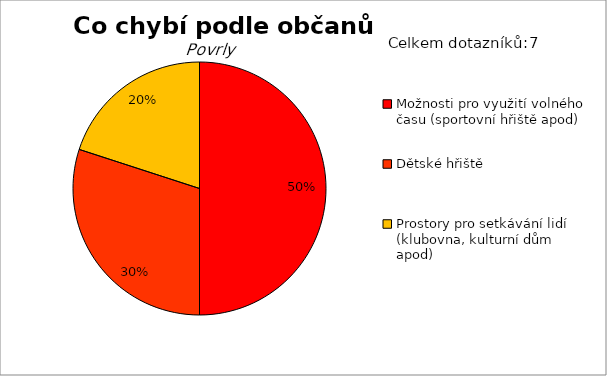
| Category | Series 0 |
|---|---|
| Možnosti pro využití volného času (sportovní hřiště apod) | 5 |
| Dětské hřiště | 3 |
| Prostory pro setkávání lidí (klubovna, kulturní dům apod) | 2 |